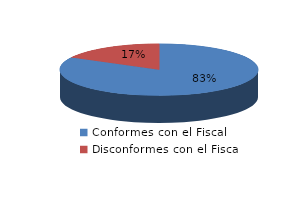
| Category | Series 0 |
|---|---|
| 0 | 16405 |
| 1 | 3415 |